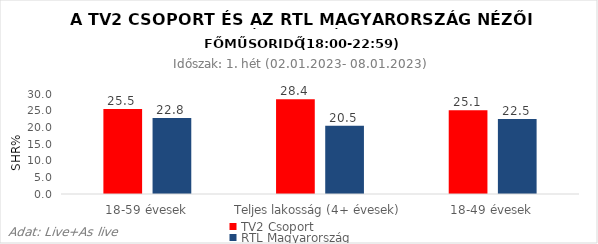
| Category | TV2 Csoport | RTL Magyarország |
|---|---|---|
| 18-59 évesek | 25.5 | 22.8 |
| Teljes lakosság (4+ évesek) | 28.4 | 20.5 |
| 18-49 évesek | 25.1 | 22.5 |